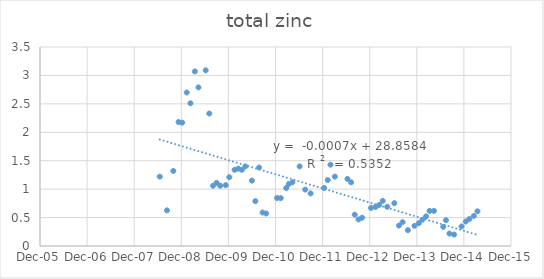
| Category | Series 0 |
|---|---|
| 39618.0 | 1.22 |
| 39674.0 | 0.627 |
| 39723.0 | 1.32 |
| 39764.0 | 2.18 |
| 39792.0 | 2.17 |
| 39827.0 | 2.7 |
| 39856.0 | 2.51 |
| 39890.0 | 3.07 |
| 39918.0 | 2.79 |
| 39974.0 | 3.09 |
| 40002.0 | 2.33 |
| 40031.0 | 1.06 |
| 40059.0 | 1.11 |
| 40087.0 | 1.06 |
| 40129.0 | 1.07 |
| 40157.0 | 1.21 |
| 40198.0 | 1.34 |
| 40226.0 | 1.36 |
| 40282.0 | 1.4 |
| 40254.0 | 1.34 |
| 40332.0 | 1.15 |
| 40359.0 | 0.789 |
| 40388.0 | 1.38 |
| 40415.0 | 0.589 |
| 40443.0 | 0.572 |
| 40527.0 | 0.844 |
| 40556.0 | 0.842 |
| 40598.0 | 1.02 |
| 40618.0 | 1.09 |
| 40646.0 | 1.12 |
| 40702.0 | 1.4 |
| 40745.0 | 0.992 |
| 40787.0 | 0.925 |
| 40892.0 | 1.02 |
| 40920.0 | 1.16 |
| 40941.0 | 1.43 |
| 40975.0 | 1.22 |
| 41073.0 | 1.18 |
| 41101.0 | 1.12 |
| 41129.0 | 0.551 |
| 41158.0 | 0.467 |
| 41186.0 | 0.497 |
| 41255.0 | 0.669 |
| 41290.0 | 0.686 |
| 41318.0 | 0.723 |
| 41346.0 | 0.794 |
| 41381.0 | 0.69 |
| 41436.0 | 0.753 |
| 41472.0 | 0.36 |
| 41500.0 | 0.419 |
| 41541.0 | 0.279 |
| 41592.0 | 0.355 |
| 41626.0 | 0.402 |
| 41653.0 | 0.462 |
| 41682.0 | 0.521 |
| 41709.0 | 0.618 |
| 41743.0 | 0.617 |
| 41815.0 | 0.337 |
| 41836.0 | 0.454 |
| 41863.0 | 0.219 |
| 41899.0 | 0.202 |
| 41957.0 | 0.344 |
| 41989.0 | 0.43 |
| 42017.0 | 0.475 |
| 42052.0 | 0.529 |
| 42080.0 | 0.61 |